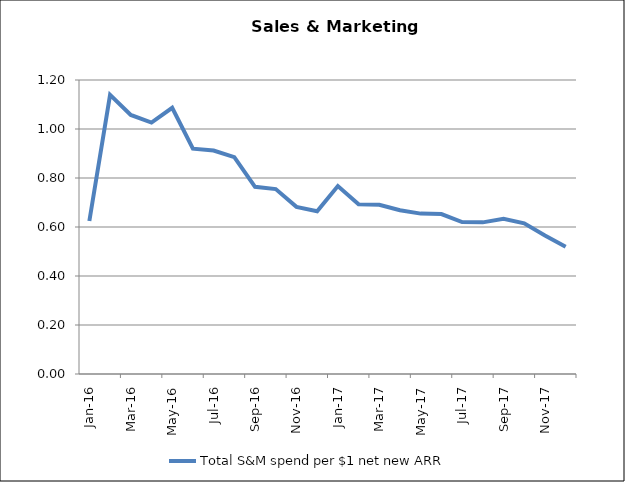
| Category | Total S&M spend per $1 net new ARR |
|---|---|
| 2016-01-01 | 0.624 |
| 2016-02-01 | 1.139 |
| 2016-03-01 | 1.057 |
| 2016-04-01 | 1.026 |
| 2016-05-01 | 1.087 |
| 2016-06-01 | 0.92 |
| 2016-07-01 | 0.912 |
| 2016-08-01 | 0.885 |
| 2016-09-01 | 0.764 |
| 2016-10-01 | 0.755 |
| 2016-11-01 | 0.682 |
| 2016-12-01 | 0.664 |
| 2017-01-01 | 0.767 |
| 2017-02-01 | 0.692 |
| 2017-03-01 | 0.69 |
| 2017-04-01 | 0.668 |
| 2017-05-01 | 0.655 |
| 2017-06-01 | 0.653 |
| 2017-07-01 | 0.62 |
| 2017-08-01 | 0.619 |
| 2017-09-01 | 0.633 |
| 2017-10-01 | 0.615 |
| 2017-11-01 | 0.565 |
| 2017-12-01 | 0.52 |